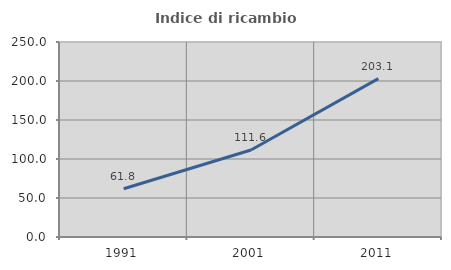
| Category | Indice di ricambio occupazionale  |
|---|---|
| 1991.0 | 61.798 |
| 2001.0 | 111.594 |
| 2011.0 | 203.077 |